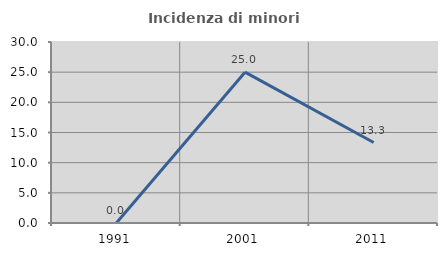
| Category | Incidenza di minori stranieri |
|---|---|
| 1991.0 | 0 |
| 2001.0 | 25 |
| 2011.0 | 13.333 |